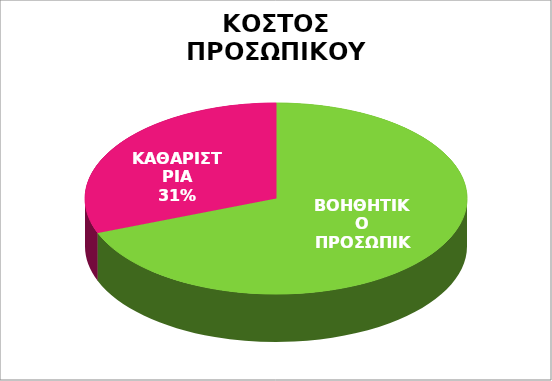
| Category | Series 0 |
|---|---|
| ΒΟΗΘΗΤΙΚΟ ΠΡΟΣΩΠΙΚΟ | 5824 |
| ΚΑΘΑΡΙΣΤΡΙΑ | 2600 |